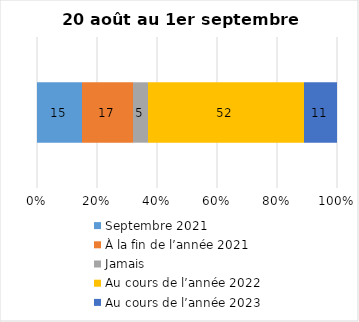
| Category | Septembre 2021 | À la fin de l’année 2021 | Jamais | Au cours de l’année 2022 | Au cours de l’année 2023 |
|---|---|---|---|---|---|
| 0 | 15 | 17 | 5 | 52 | 11 |